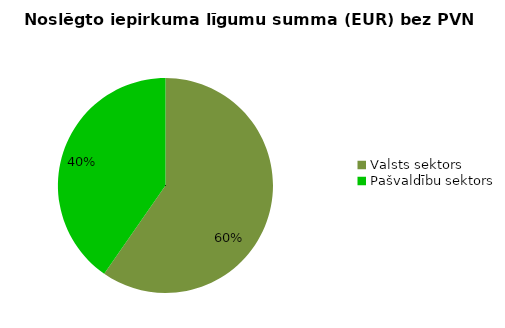
| Category | Noslēgto iepirkuma līgumu summa (EUR) bez PVN |
|---|---|
| Valsts sektors | 14389040 |
| Pašvaldību sektors | 9729253 |